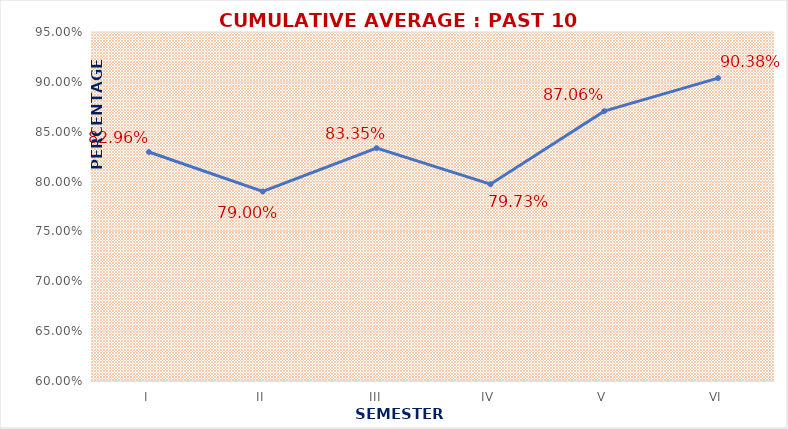
| Category | CUMULATIVE AVERAGE : PAST 10 YEARS |
|---|---|
| I | 0.83 |
| II | 0.79 |
| III | 0.834 |
| IV | 0.797 |
| V | 0.871 |
| VI | 0.904 |